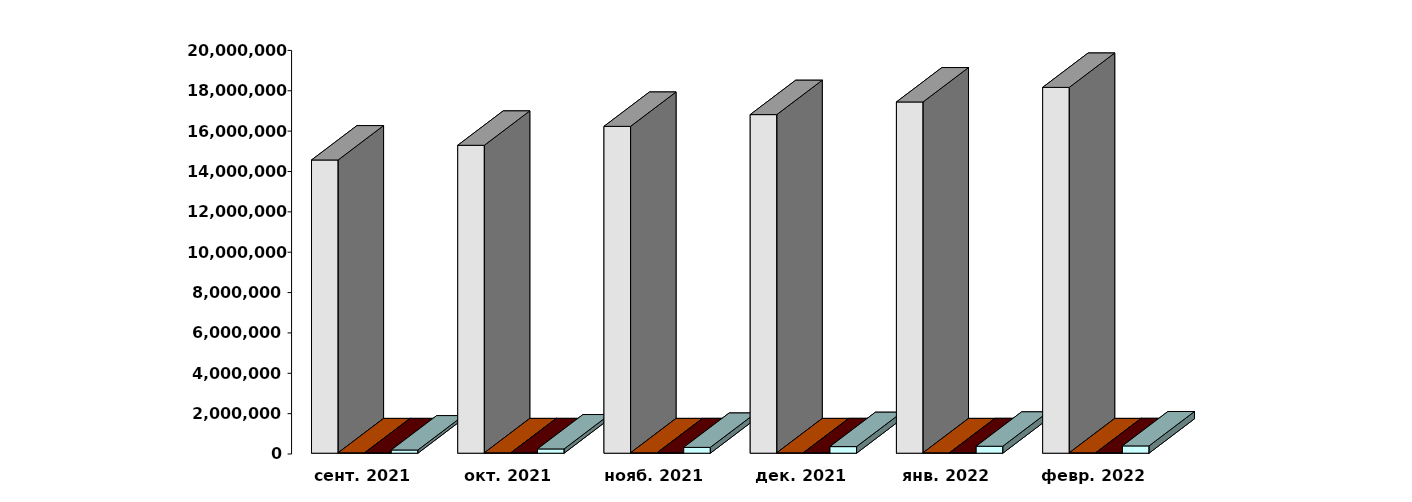
| Category | Физические лица | Юридические лица | Иностранные лица | Клиенты, передавшие свои средства в ДУ |
|---|---|---|---|---|
| 2021-09-28 | 14530193 | 20081 | 21060 | 158895 |
| 2021-10-28 | 15258509 | 20154 | 21894 | 212008 |
| 2021-11-28 | 16196130 | 20272 | 22719 | 288895 |
| 2021-12-28 | 16779069 | 20446 | 23517 | 327432 |
| 2022-01-28 | 17405817 | 20536 | 24147 | 345411 |
| 2022-02-28 | 18128529 | 20698 | 24500 | 361205 |